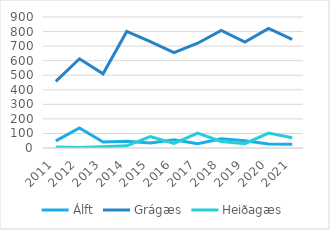
| Category | Álft | Grágæs | Heiðagæs |
|---|---|---|---|
| 2011.0 | 49 | 458 | 7 |
| 2012.0 | 138 | 613 | 4 |
| 2013.0 | 41 | 510 | 9 |
| 2014.0 | 46 | 801 | 15 |
| 2015.0 | 34 | 730 | 78 |
| 2016.0 | 57 | 655 | 32 |
| 2017.0 | 30 | 720 | 103 |
| 2018.0 | 63 | 808 | 45 |
| 2019.0 | 50 | 728 | 30 |
| 2020.0 | 28 | 822 | 103 |
| 2021.0 | 26 | 747 | 71 |